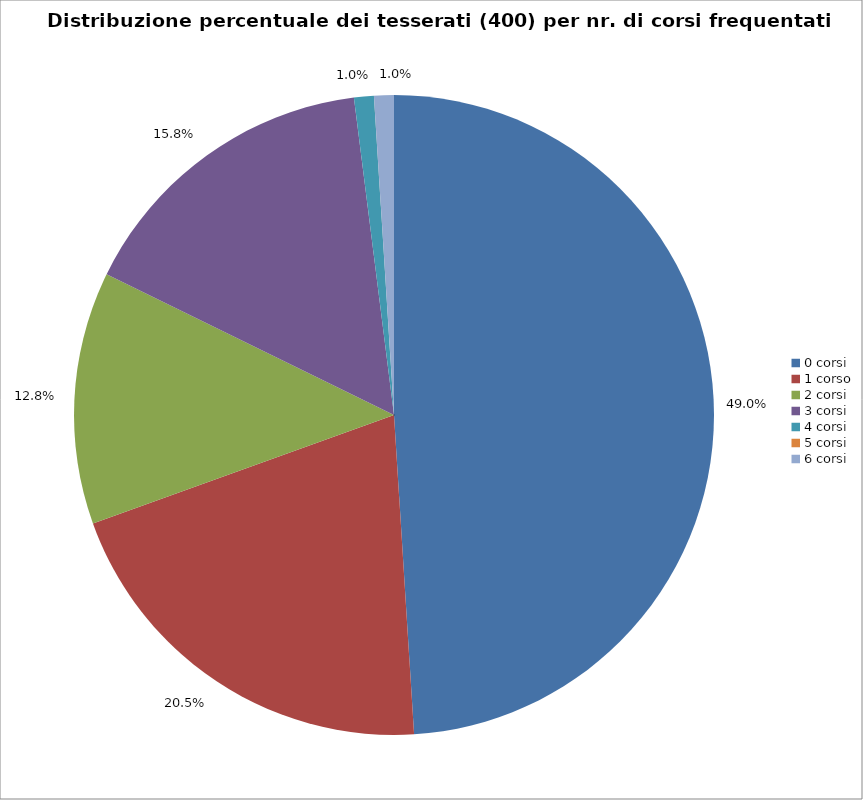
| Category | Nr. Tesserati |
|---|---|
| 0 corsi | 196 |
| 1 corso | 82 |
| 2 corsi | 51 |
| 3 corsi | 63 |
| 4 corsi | 4 |
| 5 corsi | 0 |
| 6 corsi | 4 |